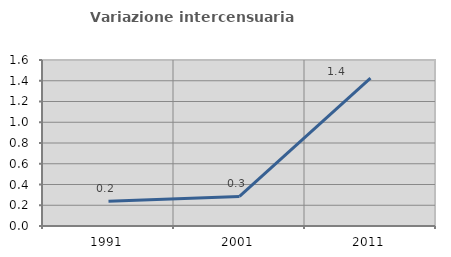
| Category | Variazione intercensuaria annua |
|---|---|
| 1991.0 | 0.239 |
| 2001.0 | 0.285 |
| 2011.0 | 1.424 |